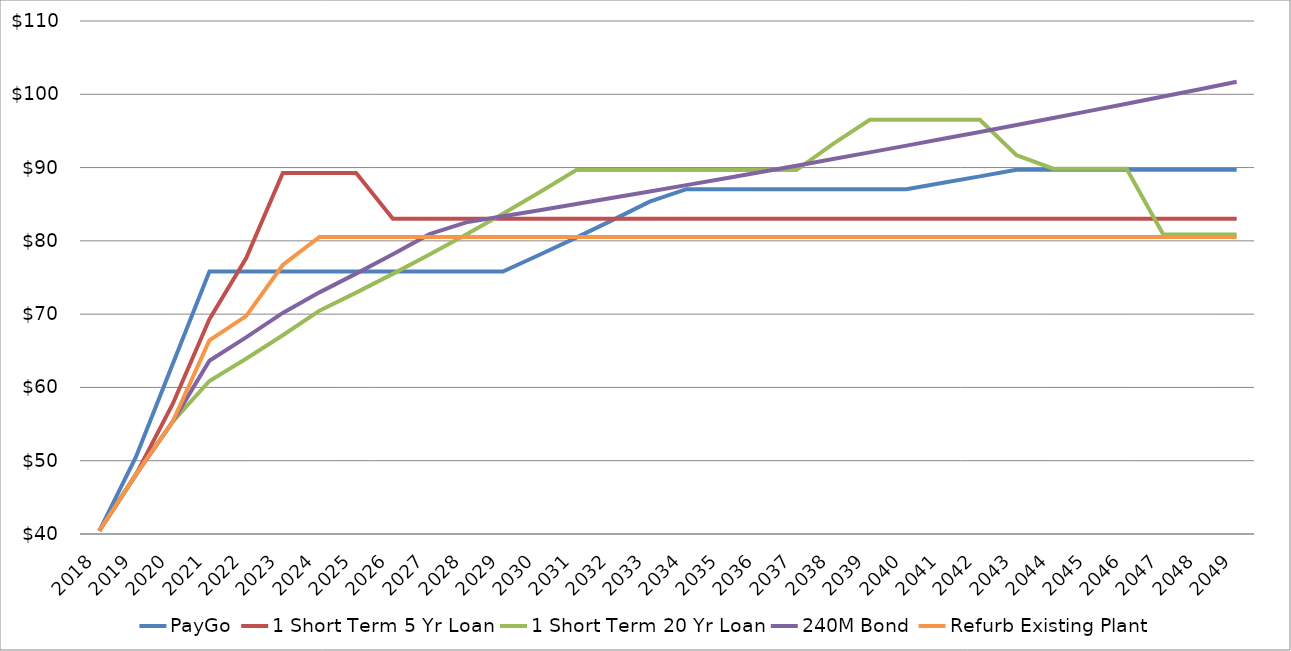
| Category | PayGo | 1 Short Term 5 Yr Loan | 1 Short Term 20 Yr Loan | 240M Bond | Refurb Existing Plant |
|---|---|---|---|---|---|
| 2018.0 | 40.44 | 40.44 | 40.44 | 40.44 |  |
| 2019.0 | 50.55 | 48.124 | 48.124 | 48.124 |  |
| 2020.0 | 63.188 | 57.748 | 55.342 | 55.342 |  |
| 2021.0 | 75.825 | 69.298 | 60.876 | 63.643 |  |
| 2022.0 | 75.825 | 77.614 | 63.92 | 66.826 |  |
| 2023.0 | 75.825 | 89.256 | 67.116 | 70.167 |  |
| 2024.0 | 75.825 | 89.256 | 70.472 | 72.974 |  |
| 2025.0 | 75.825 | 89.256 | 72.939 | 75.528 |  |
| 2026.0 | 75.825 | 83.008 | 75.491 | 78.171 |  |
| 2027.0 | 75.825 | 83.008 | 78.134 | 80.907 |  |
| 2028.0 | 75.825 | 83.008 | 80.868 | 82.525 |  |
| 2029.0 | 75.825 | 83.008 | 83.699 | 83.351 |  |
| 2030.0 | 78.1 | 83.008 | 86.628 | 84.184 |  |
| 2031.0 | 80.443 | 83.008 | 89.66 | 85.026 |  |
| 2032.0 | 82.856 | 83.008 | 89.66 | 85.876 |  |
| 2033.0 | 85.342 | 83.008 | 89.66 | 86.735 |  |
| 2034.0 | 87.049 | 83.008 | 89.66 | 87.602 |  |
| 2035.0 | 87.049 | 83.008 | 89.66 | 88.478 |  |
| 2036.0 | 87.049 | 83.008 | 89.66 | 89.363 |  |
| 2037.0 | 87.049 | 83.008 | 89.66 | 90.257 |  |
| 2038.0 | 87.049 | 83.008 | 93.246 | 91.159 |  |
| 2039.0 | 87.049 | 83.008 | 96.51 | 92.071 |  |
| 2040.0 | 87.049 | 83.008 | 96.51 | 92.992 |  |
| 2041.0 | 87.919 | 83.008 | 96.51 | 93.921 |  |
| 2042.0 | 88.798 | 83.008 | 96.51 | 94.861 |  |
| 2043.0 | 89.686 | 83.008 | 91.685 | 95.809 |  |
| 2044.0 | 89.686 | 83.008 | 89.851 | 96.767 |  |
| 2045.0 | 89.686 | 83.008 | 89.851 | 97.735 |  |
| 2046.0 | 89.686 | 83.008 | 89.851 | 98.712 |  |
| 2047.0 | 89.686 | 83.008 | 80.866 | 99.7 |  |
| 2048.0 | 89.686 | 83.008 | 80.866 | 100.697 |  |
| 2049.0 | 89.686 | 83.008 | 80.866 | 101.703 |  |